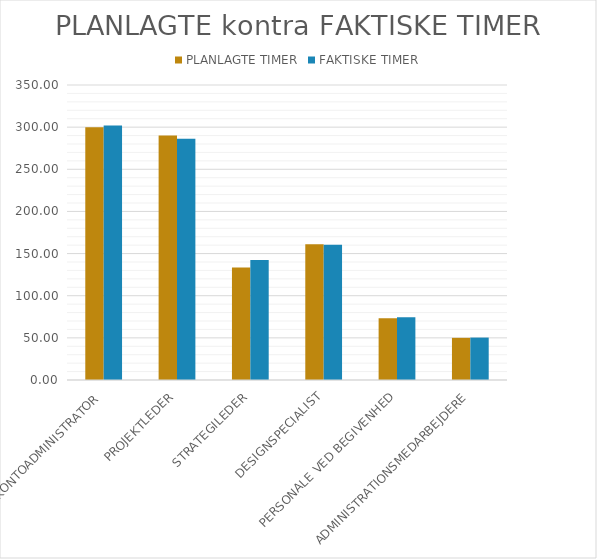
| Category | PLANLAGTE TIMER | FAKTISKE TIMER |
|---|---|---|
| KONTOADMINISTRATOR | 300 | 302 |
| PROJEKTLEDER | 290 | 286.333 |
| STRATEGILEDER | 133.333 | 142.5 |
| DESIGNSPECIALIST | 161.111 | 160.556 |
| PERSONALE VED BEGIVENHED | 73.333 | 74.444 |
| ADMINISTRATIONSMEDARBEJDERE | 50 | 50.333 |